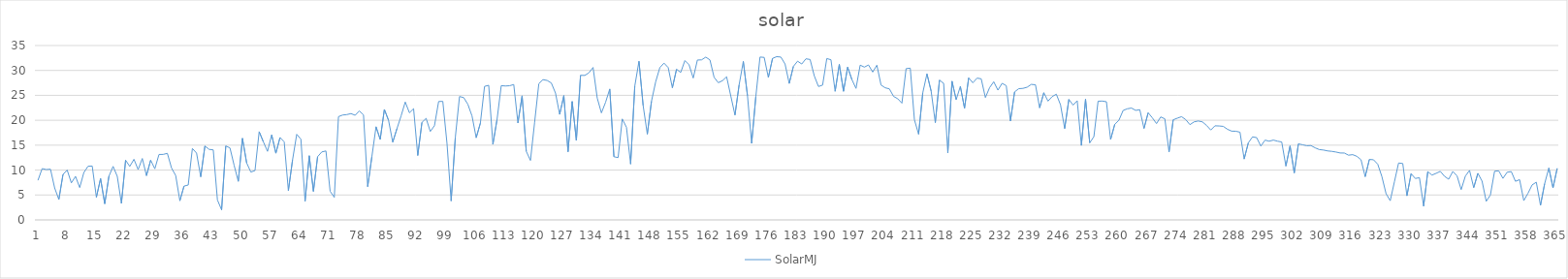
| Category | SolarMJ |
|---|---|
| 0 | 7.948 |
| 1 | 10.299 |
| 2 | 10.109 |
| 3 | 10.18 |
| 4 | 6.416 |
| 5 | 4.094 |
| 6 | 9.119 |
| 7 | 10.012 |
| 8 | 7.426 |
| 9 | 8.737 |
| 10 | 6.489 |
| 11 | 9.517 |
| 12 | 10.772 |
| 13 | 10.812 |
| 14 | 4.545 |
| 15 | 8.296 |
| 16 | 3.241 |
| 17 | 8.757 |
| 18 | 10.739 |
| 19 | 8.753 |
| 20 | 3.31 |
| 21 | 11.983 |
| 22 | 10.738 |
| 23 | 12.163 |
| 24 | 10.1 |
| 25 | 12.328 |
| 26 | 8.88 |
| 27 | 11.977 |
| 28 | 10.26 |
| 29 | 13.132 |
| 30 | 13.149 |
| 31 | 13.361 |
| 32 | 10.425 |
| 33 | 8.907 |
| 34 | 3.845 |
| 35 | 6.79 |
| 36 | 6.998 |
| 37 | 14.336 |
| 38 | 13.402 |
| 39 | 8.647 |
| 40 | 14.829 |
| 41 | 14.164 |
| 42 | 14.049 |
| 43 | 4.007 |
| 44 | 2.014 |
| 45 | 14.846 |
| 46 | 14.452 |
| 47 | 10.954 |
| 48 | 7.736 |
| 49 | 16.381 |
| 50 | 11.444 |
| 51 | 9.601 |
| 52 | 9.9 |
| 53 | 17.707 |
| 54 | 15.683 |
| 55 | 13.763 |
| 56 | 17.078 |
| 57 | 13.394 |
| 58 | 16.536 |
| 59 | 15.65 |
| 60 | 5.879 |
| 61 | 12.04 |
| 62 | 17.187 |
| 63 | 16.189 |
| 64 | 3.735 |
| 65 | 12.876 |
| 66 | 5.732 |
| 67 | 12.684 |
| 68 | 13.646 |
| 69 | 13.84 |
| 70 | 5.753 |
| 71 | 4.533 |
| 72 | 20.727 |
| 73 | 21.053 |
| 74 | 21.135 |
| 75 | 21.338 |
| 76 | 20.997 |
| 77 | 21.867 |
| 78 | 21.088 |
| 79 | 6.674 |
| 80 | 12.662 |
| 81 | 18.691 |
| 82 | 16.159 |
| 83 | 22.171 |
| 84 | 19.99 |
| 85 | 15.597 |
| 86 | 18.28 |
| 87 | 20.871 |
| 88 | 23.664 |
| 89 | 21.506 |
| 90 | 22.329 |
| 91 | 12.928 |
| 92 | 19.574 |
| 93 | 20.38 |
| 94 | 17.749 |
| 95 | 18.913 |
| 96 | 23.769 |
| 97 | 23.783 |
| 98 | 15.371 |
| 99 | 3.806 |
| 100 | 16.588 |
| 101 | 24.76 |
| 102 | 24.554 |
| 103 | 23.211 |
| 104 | 20.86 |
| 105 | 16.493 |
| 106 | 19.423 |
| 107 | 26.8 |
| 108 | 27.018 |
| 109 | 15.161 |
| 110 | 20.182 |
| 111 | 26.944 |
| 112 | 26.881 |
| 113 | 26.93 |
| 114 | 27.173 |
| 115 | 19.459 |
| 116 | 24.906 |
| 117 | 13.765 |
| 118 | 11.936 |
| 119 | 19.607 |
| 120 | 27.324 |
| 121 | 28.153 |
| 122 | 27.99 |
| 123 | 27.482 |
| 124 | 25.457 |
| 125 | 21.181 |
| 126 | 24.949 |
| 127 | 13.688 |
| 128 | 23.768 |
| 129 | 15.944 |
| 130 | 29.023 |
| 131 | 28.999 |
| 132 | 29.514 |
| 133 | 30.598 |
| 134 | 24.46 |
| 135 | 21.483 |
| 136 | 23.612 |
| 137 | 26.272 |
| 138 | 12.675 |
| 139 | 12.508 |
| 140 | 20.264 |
| 141 | 18.593 |
| 142 | 11.21 |
| 143 | 26.867 |
| 144 | 31.841 |
| 145 | 22.965 |
| 146 | 17.214 |
| 147 | 23.822 |
| 148 | 27.721 |
| 149 | 30.565 |
| 150 | 31.474 |
| 151 | 30.582 |
| 152 | 26.523 |
| 153 | 30.234 |
| 154 | 29.597 |
| 155 | 31.98 |
| 156 | 31.134 |
| 157 | 28.475 |
| 158 | 32.09 |
| 159 | 32.128 |
| 160 | 32.675 |
| 161 | 32.12 |
| 162 | 28.622 |
| 163 | 27.54 |
| 164 | 27.939 |
| 165 | 28.724 |
| 166 | 24.87 |
| 167 | 21.051 |
| 168 | 27.126 |
| 169 | 31.814 |
| 170 | 24.924 |
| 171 | 15.357 |
| 172 | 24.777 |
| 173 | 32.69 |
| 174 | 32.616 |
| 175 | 28.59 |
| 176 | 32.416 |
| 177 | 32.769 |
| 178 | 32.686 |
| 179 | 31.289 |
| 180 | 27.389 |
| 181 | 30.811 |
| 182 | 31.86 |
| 183 | 31.296 |
| 184 | 32.338 |
| 185 | 32.202 |
| 186 | 28.932 |
| 187 | 26.776 |
| 188 | 27.06 |
| 189 | 32.389 |
| 190 | 32.147 |
| 191 | 25.814 |
| 192 | 31.211 |
| 193 | 25.817 |
| 194 | 30.651 |
| 195 | 28.202 |
| 196 | 26.394 |
| 197 | 31.066 |
| 198 | 30.667 |
| 199 | 31.094 |
| 200 | 29.674 |
| 201 | 31.052 |
| 202 | 27.064 |
| 203 | 26.517 |
| 204 | 26.299 |
| 205 | 24.79 |
| 206 | 24.318 |
| 207 | 23.43 |
| 208 | 30.363 |
| 209 | 30.453 |
| 210 | 20.09 |
| 211 | 17.203 |
| 212 | 25.518 |
| 213 | 29.316 |
| 214 | 25.871 |
| 215 | 19.528 |
| 216 | 28.062 |
| 217 | 27.403 |
| 218 | 13.447 |
| 219 | 27.835 |
| 220 | 24.143 |
| 221 | 26.791 |
| 222 | 22.43 |
| 223 | 28.508 |
| 224 | 27.523 |
| 225 | 28.457 |
| 226 | 28.32 |
| 227 | 24.559 |
| 228 | 26.534 |
| 229 | 27.727 |
| 230 | 26.05 |
| 231 | 27.41 |
| 232 | 26.951 |
| 233 | 19.841 |
| 234 | 25.692 |
| 235 | 26.342 |
| 236 | 26.401 |
| 237 | 26.633 |
| 238 | 27.199 |
| 239 | 27.123 |
| 240 | 22.492 |
| 241 | 25.524 |
| 242 | 23.839 |
| 243 | 24.755 |
| 244 | 25.224 |
| 245 | 23.098 |
| 246 | 18.333 |
| 247 | 24.188 |
| 248 | 23.048 |
| 249 | 23.917 |
| 250 | 14.948 |
| 251 | 24.206 |
| 252 | 15.47 |
| 253 | 16.715 |
| 254 | 23.828 |
| 255 | 23.85 |
| 256 | 23.715 |
| 257 | 16.14 |
| 258 | 19.19 |
| 259 | 20.018 |
| 260 | 21.97 |
| 261 | 22.302 |
| 262 | 22.453 |
| 263 | 21.984 |
| 264 | 22.123 |
| 265 | 18.362 |
| 266 | 21.505 |
| 267 | 20.49 |
| 268 | 19.337 |
| 269 | 20.668 |
| 270 | 20.292 |
| 271 | 13.619 |
| 272 | 20.097 |
| 273 | 20.424 |
| 274 | 20.72 |
| 275 | 20.129 |
| 276 | 19.122 |
| 277 | 19.676 |
| 278 | 19.856 |
| 279 | 19.679 |
| 280 | 18.966 |
| 281 | 18.036 |
| 282 | 18.883 |
| 283 | 18.853 |
| 284 | 18.77 |
| 285 | 18.191 |
| 286 | 17.813 |
| 287 | 17.8 |
| 288 | 17.605 |
| 289 | 12.22 |
| 290 | 15.471 |
| 291 | 16.663 |
| 292 | 16.513 |
| 293 | 14.816 |
| 294 | 16.009 |
| 295 | 15.801 |
| 296 | 16.018 |
| 297 | 15.797 |
| 298 | 15.641 |
| 299 | 10.802 |
| 300 | 14.851 |
| 301 | 9.437 |
| 302 | 15.264 |
| 303 | 15.079 |
| 304 | 14.891 |
| 305 | 14.926 |
| 306 | 14.47 |
| 307 | 14.12 |
| 308 | 14.026 |
| 309 | 13.851 |
| 310 | 13.759 |
| 311 | 13.626 |
| 312 | 13.433 |
| 313 | 13.424 |
| 314 | 12.993 |
| 315 | 13.098 |
| 316 | 12.765 |
| 317 | 12.075 |
| 318 | 8.68 |
| 319 | 12.139 |
| 320 | 12.07 |
| 321 | 11.188 |
| 322 | 8.703 |
| 323 | 5.261 |
| 324 | 3.854 |
| 325 | 7.65 |
| 326 | 11.419 |
| 327 | 11.316 |
| 328 | 4.834 |
| 329 | 9.283 |
| 330 | 8.313 |
| 331 | 8.478 |
| 332 | 2.762 |
| 333 | 9.682 |
| 334 | 8.998 |
| 335 | 9.351 |
| 336 | 9.741 |
| 337 | 8.753 |
| 338 | 8.168 |
| 339 | 9.732 |
| 340 | 8.85 |
| 341 | 6.081 |
| 342 | 8.8 |
| 343 | 9.938 |
| 344 | 6.483 |
| 345 | 9.35 |
| 346 | 7.788 |
| 347 | 3.73 |
| 348 | 4.998 |
| 349 | 9.778 |
| 350 | 9.848 |
| 351 | 8.338 |
| 352 | 9.559 |
| 353 | 9.701 |
| 354 | 7.75 |
| 355 | 8.077 |
| 356 | 3.871 |
| 357 | 5.34 |
| 358 | 7.03 |
| 359 | 7.566 |
| 360 | 2.927 |
| 361 | 7.278 |
| 362 | 10.417 |
| 363 | 6.44 |
| 364 | 10.342 |